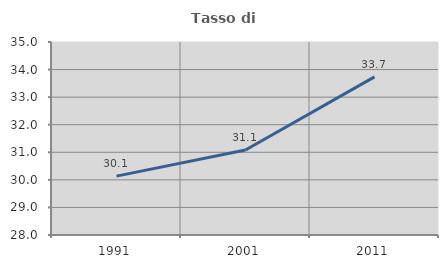
| Category | Tasso di occupazione   |
|---|---|
| 1991.0 | 30.136 |
| 2001.0 | 31.082 |
| 2011.0 | 33.733 |